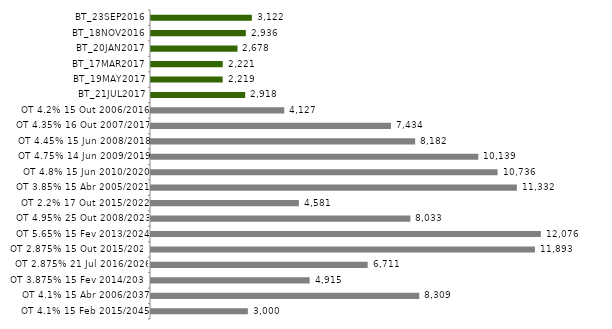
| Category | Series 0 |
|---|---|
| BT_23SEP2016 | 3122.408 |
| BT_18NOV2016 | 2936.177 |
| BT_20JAN2017 | 2678.416 |
| BT_17MAR2017 | 2221.441 |
| BT_19MAY2017 | 2219.402 |
| BT_21JUL2017 | 2917.586 |
| OT 4.2% 15 Out 2006/2016 | 4127.125 |
| OT 4.35% 16 Out 2007/2017 | 7433.558 |
| OT 4.45% 15 Jun 2008/2018 | 8181.745 |
| OT 4.75% 14 Jun 2009/2019 | 10138.75 |
| OT 4.8% 15 Jun 2010/2020 | 10735.8 |
| OT 3.85% 15 Abr 2005/2021 | 11331.772 |
| OT 2.2% 17 Out 2015/2022 | 4580.525 |
| OT 4.95% 25 Out 2008/2023 | 8032.963 |
| OT 5.65% 15 Fev 2013/2024 | 12075.636 |
| OT 2.875% 15 Out 2015/2025 | 11892.697 |
| OT 2.875% 21 Jul 2016/2026 | 6711.456 |
| OT 3.875% 15 Fev 2014/2030 | 4914.902 |
| OT 4.1% 15 Abr 2006/2037 | 8309.307 |
| OT 4.1% 15 Feb 2015/2045 | 3000 |